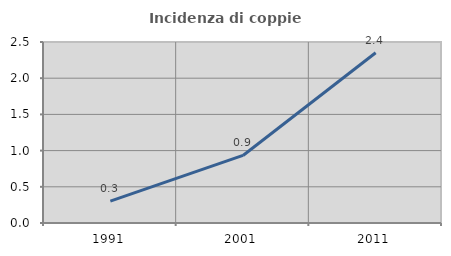
| Category | Incidenza di coppie miste |
|---|---|
| 1991.0 | 0.302 |
| 2001.0 | 0.933 |
| 2011.0 | 2.351 |